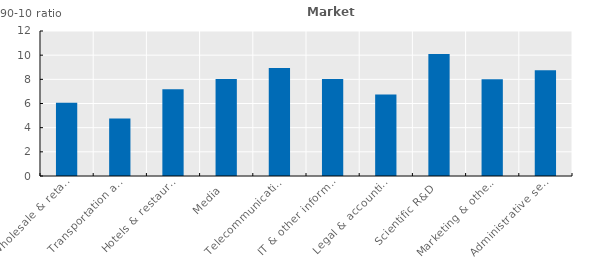
| Category | Series 0 |
|---|---|
| Wholesale & retail | 6.06 |
| Transportation and storage | 4.755 |
| Hotels & restaurants | 7.184 |
| Media  | 8.02 |
| Telecommunications  | 8.939 |
| IT & other information serv. | 8.028 |
| Legal & accounting | 6.737 |
| Scientific R&D  | 10.102 |
| Marketing & other  | 8.012 |
| Administrative services  | 8.758 |